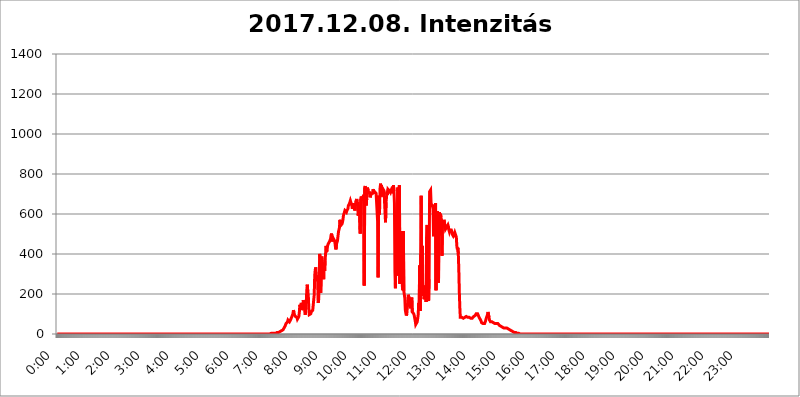
| Category | 2017.12.08. Intenzitás [W/m^2] |
|---|---|
| 0.0 | 0 |
| 0.0006944444444444445 | 0 |
| 0.001388888888888889 | 0 |
| 0.0020833333333333333 | 0 |
| 0.002777777777777778 | 0 |
| 0.003472222222222222 | 0 |
| 0.004166666666666667 | 0 |
| 0.004861111111111111 | 0 |
| 0.005555555555555556 | 0 |
| 0.0062499999999999995 | 0 |
| 0.006944444444444444 | 0 |
| 0.007638888888888889 | 0 |
| 0.008333333333333333 | 0 |
| 0.009027777777777779 | 0 |
| 0.009722222222222222 | 0 |
| 0.010416666666666666 | 0 |
| 0.011111111111111112 | 0 |
| 0.011805555555555555 | 0 |
| 0.012499999999999999 | 0 |
| 0.013194444444444444 | 0 |
| 0.013888888888888888 | 0 |
| 0.014583333333333332 | 0 |
| 0.015277777777777777 | 0 |
| 0.015972222222222224 | 0 |
| 0.016666666666666666 | 0 |
| 0.017361111111111112 | 0 |
| 0.018055555555555557 | 0 |
| 0.01875 | 0 |
| 0.019444444444444445 | 0 |
| 0.02013888888888889 | 0 |
| 0.020833333333333332 | 0 |
| 0.02152777777777778 | 0 |
| 0.022222222222222223 | 0 |
| 0.02291666666666667 | 0 |
| 0.02361111111111111 | 0 |
| 0.024305555555555556 | 0 |
| 0.024999999999999998 | 0 |
| 0.025694444444444447 | 0 |
| 0.02638888888888889 | 0 |
| 0.027083333333333334 | 0 |
| 0.027777777777777776 | 0 |
| 0.02847222222222222 | 0 |
| 0.029166666666666664 | 0 |
| 0.029861111111111113 | 0 |
| 0.030555555555555555 | 0 |
| 0.03125 | 0 |
| 0.03194444444444445 | 0 |
| 0.03263888888888889 | 0 |
| 0.03333333333333333 | 0 |
| 0.034027777777777775 | 0 |
| 0.034722222222222224 | 0 |
| 0.035416666666666666 | 0 |
| 0.036111111111111115 | 0 |
| 0.03680555555555556 | 0 |
| 0.0375 | 0 |
| 0.03819444444444444 | 0 |
| 0.03888888888888889 | 0 |
| 0.03958333333333333 | 0 |
| 0.04027777777777778 | 0 |
| 0.04097222222222222 | 0 |
| 0.041666666666666664 | 0 |
| 0.042361111111111106 | 0 |
| 0.04305555555555556 | 0 |
| 0.043750000000000004 | 0 |
| 0.044444444444444446 | 0 |
| 0.04513888888888889 | 0 |
| 0.04583333333333334 | 0 |
| 0.04652777777777778 | 0 |
| 0.04722222222222222 | 0 |
| 0.04791666666666666 | 0 |
| 0.04861111111111111 | 0 |
| 0.049305555555555554 | 0 |
| 0.049999999999999996 | 0 |
| 0.05069444444444445 | 0 |
| 0.051388888888888894 | 0 |
| 0.052083333333333336 | 0 |
| 0.05277777777777778 | 0 |
| 0.05347222222222222 | 0 |
| 0.05416666666666667 | 0 |
| 0.05486111111111111 | 0 |
| 0.05555555555555555 | 0 |
| 0.05625 | 0 |
| 0.05694444444444444 | 0 |
| 0.057638888888888885 | 0 |
| 0.05833333333333333 | 0 |
| 0.05902777777777778 | 0 |
| 0.059722222222222225 | 0 |
| 0.06041666666666667 | 0 |
| 0.061111111111111116 | 0 |
| 0.06180555555555556 | 0 |
| 0.0625 | 0 |
| 0.06319444444444444 | 0 |
| 0.06388888888888888 | 0 |
| 0.06458333333333334 | 0 |
| 0.06527777777777778 | 0 |
| 0.06597222222222222 | 0 |
| 0.06666666666666667 | 0 |
| 0.06736111111111111 | 0 |
| 0.06805555555555555 | 0 |
| 0.06874999999999999 | 0 |
| 0.06944444444444443 | 0 |
| 0.07013888888888889 | 0 |
| 0.07083333333333333 | 0 |
| 0.07152777777777779 | 0 |
| 0.07222222222222223 | 0 |
| 0.07291666666666667 | 0 |
| 0.07361111111111111 | 0 |
| 0.07430555555555556 | 0 |
| 0.075 | 0 |
| 0.07569444444444444 | 0 |
| 0.0763888888888889 | 0 |
| 0.07708333333333334 | 0 |
| 0.07777777777777778 | 0 |
| 0.07847222222222222 | 0 |
| 0.07916666666666666 | 0 |
| 0.0798611111111111 | 0 |
| 0.08055555555555556 | 0 |
| 0.08125 | 0 |
| 0.08194444444444444 | 0 |
| 0.08263888888888889 | 0 |
| 0.08333333333333333 | 0 |
| 0.08402777777777777 | 0 |
| 0.08472222222222221 | 0 |
| 0.08541666666666665 | 0 |
| 0.08611111111111112 | 0 |
| 0.08680555555555557 | 0 |
| 0.08750000000000001 | 0 |
| 0.08819444444444445 | 0 |
| 0.08888888888888889 | 0 |
| 0.08958333333333333 | 0 |
| 0.09027777777777778 | 0 |
| 0.09097222222222222 | 0 |
| 0.09166666666666667 | 0 |
| 0.09236111111111112 | 0 |
| 0.09305555555555556 | 0 |
| 0.09375 | 0 |
| 0.09444444444444444 | 0 |
| 0.09513888888888888 | 0 |
| 0.09583333333333333 | 0 |
| 0.09652777777777777 | 0 |
| 0.09722222222222222 | 0 |
| 0.09791666666666667 | 0 |
| 0.09861111111111111 | 0 |
| 0.09930555555555555 | 0 |
| 0.09999999999999999 | 0 |
| 0.10069444444444443 | 0 |
| 0.1013888888888889 | 0 |
| 0.10208333333333335 | 0 |
| 0.10277777777777779 | 0 |
| 0.10347222222222223 | 0 |
| 0.10416666666666667 | 0 |
| 0.10486111111111111 | 0 |
| 0.10555555555555556 | 0 |
| 0.10625 | 0 |
| 0.10694444444444444 | 0 |
| 0.1076388888888889 | 0 |
| 0.10833333333333334 | 0 |
| 0.10902777777777778 | 0 |
| 0.10972222222222222 | 0 |
| 0.1111111111111111 | 0 |
| 0.11180555555555556 | 0 |
| 0.11180555555555556 | 0 |
| 0.1125 | 0 |
| 0.11319444444444444 | 0 |
| 0.11388888888888889 | 0 |
| 0.11458333333333333 | 0 |
| 0.11527777777777777 | 0 |
| 0.11597222222222221 | 0 |
| 0.11666666666666665 | 0 |
| 0.1173611111111111 | 0 |
| 0.11805555555555557 | 0 |
| 0.11944444444444445 | 0 |
| 0.12013888888888889 | 0 |
| 0.12083333333333333 | 0 |
| 0.12152777777777778 | 0 |
| 0.12222222222222223 | 0 |
| 0.12291666666666667 | 0 |
| 0.12291666666666667 | 0 |
| 0.12361111111111112 | 0 |
| 0.12430555555555556 | 0 |
| 0.125 | 0 |
| 0.12569444444444444 | 0 |
| 0.12638888888888888 | 0 |
| 0.12708333333333333 | 0 |
| 0.16875 | 0 |
| 0.12847222222222224 | 0 |
| 0.12916666666666668 | 0 |
| 0.12986111111111112 | 0 |
| 0.13055555555555556 | 0 |
| 0.13125 | 0 |
| 0.13194444444444445 | 0 |
| 0.1326388888888889 | 0 |
| 0.13333333333333333 | 0 |
| 0.13402777777777777 | 0 |
| 0.13402777777777777 | 0 |
| 0.13472222222222222 | 0 |
| 0.13541666666666666 | 0 |
| 0.1361111111111111 | 0 |
| 0.13749999999999998 | 0 |
| 0.13819444444444443 | 0 |
| 0.1388888888888889 | 0 |
| 0.13958333333333334 | 0 |
| 0.14027777777777778 | 0 |
| 0.14097222222222222 | 0 |
| 0.14166666666666666 | 0 |
| 0.1423611111111111 | 0 |
| 0.14305555555555557 | 0 |
| 0.14375000000000002 | 0 |
| 0.14444444444444446 | 0 |
| 0.1451388888888889 | 0 |
| 0.1451388888888889 | 0 |
| 0.14652777777777778 | 0 |
| 0.14722222222222223 | 0 |
| 0.14791666666666667 | 0 |
| 0.1486111111111111 | 0 |
| 0.14930555555555555 | 0 |
| 0.15 | 0 |
| 0.15069444444444444 | 0 |
| 0.15138888888888888 | 0 |
| 0.15208333333333332 | 0 |
| 0.15277777777777776 | 0 |
| 0.15347222222222223 | 0 |
| 0.15416666666666667 | 0 |
| 0.15486111111111112 | 0 |
| 0.15555555555555556 | 0 |
| 0.15625 | 0 |
| 0.15694444444444444 | 0 |
| 0.15763888888888888 | 0 |
| 0.15833333333333333 | 0 |
| 0.15902777777777777 | 0 |
| 0.15972222222222224 | 0 |
| 0.16041666666666668 | 0 |
| 0.16111111111111112 | 0 |
| 0.16180555555555556 | 0 |
| 0.1625 | 0 |
| 0.16319444444444445 | 0 |
| 0.1638888888888889 | 0 |
| 0.16458333333333333 | 0 |
| 0.16527777777777777 | 0 |
| 0.16597222222222222 | 0 |
| 0.16666666666666666 | 0 |
| 0.1673611111111111 | 0 |
| 0.16805555555555554 | 0 |
| 0.16874999999999998 | 0 |
| 0.16944444444444443 | 0 |
| 0.17013888888888887 | 0 |
| 0.1708333333333333 | 0 |
| 0.17152777777777775 | 0 |
| 0.17222222222222225 | 0 |
| 0.1729166666666667 | 0 |
| 0.17361111111111113 | 0 |
| 0.17430555555555557 | 0 |
| 0.17500000000000002 | 0 |
| 0.17569444444444446 | 0 |
| 0.1763888888888889 | 0 |
| 0.17708333333333334 | 0 |
| 0.17777777777777778 | 0 |
| 0.17847222222222223 | 0 |
| 0.17916666666666667 | 0 |
| 0.1798611111111111 | 0 |
| 0.18055555555555555 | 0 |
| 0.18125 | 0 |
| 0.18194444444444444 | 0 |
| 0.1826388888888889 | 0 |
| 0.18333333333333335 | 0 |
| 0.1840277777777778 | 0 |
| 0.18472222222222223 | 0 |
| 0.18541666666666667 | 0 |
| 0.18611111111111112 | 0 |
| 0.18680555555555556 | 0 |
| 0.1875 | 0 |
| 0.18819444444444444 | 0 |
| 0.18888888888888888 | 0 |
| 0.18958333333333333 | 0 |
| 0.19027777777777777 | 0 |
| 0.1909722222222222 | 0 |
| 0.19166666666666665 | 0 |
| 0.19236111111111112 | 0 |
| 0.19305555555555554 | 0 |
| 0.19375 | 0 |
| 0.19444444444444445 | 0 |
| 0.1951388888888889 | 0 |
| 0.19583333333333333 | 0 |
| 0.19652777777777777 | 0 |
| 0.19722222222222222 | 0 |
| 0.19791666666666666 | 0 |
| 0.1986111111111111 | 0 |
| 0.19930555555555554 | 0 |
| 0.19999999999999998 | 0 |
| 0.20069444444444443 | 0 |
| 0.20138888888888887 | 0 |
| 0.2020833333333333 | 0 |
| 0.2027777777777778 | 0 |
| 0.2034722222222222 | 0 |
| 0.2041666666666667 | 0 |
| 0.20486111111111113 | 0 |
| 0.20555555555555557 | 0 |
| 0.20625000000000002 | 0 |
| 0.20694444444444446 | 0 |
| 0.2076388888888889 | 0 |
| 0.20833333333333334 | 0 |
| 0.20902777777777778 | 0 |
| 0.20972222222222223 | 0 |
| 0.21041666666666667 | 0 |
| 0.2111111111111111 | 0 |
| 0.21180555555555555 | 0 |
| 0.2125 | 0 |
| 0.21319444444444444 | 0 |
| 0.2138888888888889 | 0 |
| 0.21458333333333335 | 0 |
| 0.2152777777777778 | 0 |
| 0.21597222222222223 | 0 |
| 0.21666666666666667 | 0 |
| 0.21736111111111112 | 0 |
| 0.21805555555555556 | 0 |
| 0.21875 | 0 |
| 0.21944444444444444 | 0 |
| 0.22013888888888888 | 0 |
| 0.22083333333333333 | 0 |
| 0.22152777777777777 | 0 |
| 0.2222222222222222 | 0 |
| 0.22291666666666665 | 0 |
| 0.2236111111111111 | 0 |
| 0.22430555555555556 | 0 |
| 0.225 | 0 |
| 0.22569444444444445 | 0 |
| 0.2263888888888889 | 0 |
| 0.22708333333333333 | 0 |
| 0.22777777777777777 | 0 |
| 0.22847222222222222 | 0 |
| 0.22916666666666666 | 0 |
| 0.2298611111111111 | 0 |
| 0.23055555555555554 | 0 |
| 0.23124999999999998 | 0 |
| 0.23194444444444443 | 0 |
| 0.23263888888888887 | 0 |
| 0.2333333333333333 | 0 |
| 0.2340277777777778 | 0 |
| 0.2347222222222222 | 0 |
| 0.2354166666666667 | 0 |
| 0.23611111111111113 | 0 |
| 0.23680555555555557 | 0 |
| 0.23750000000000002 | 0 |
| 0.23819444444444446 | 0 |
| 0.2388888888888889 | 0 |
| 0.23958333333333334 | 0 |
| 0.24027777777777778 | 0 |
| 0.24097222222222223 | 0 |
| 0.24166666666666667 | 0 |
| 0.2423611111111111 | 0 |
| 0.24305555555555555 | 0 |
| 0.24375 | 0 |
| 0.24444444444444446 | 0 |
| 0.24513888888888888 | 0 |
| 0.24583333333333335 | 0 |
| 0.2465277777777778 | 0 |
| 0.24722222222222223 | 0 |
| 0.24791666666666667 | 0 |
| 0.24861111111111112 | 0 |
| 0.24930555555555556 | 0 |
| 0.25 | 0 |
| 0.25069444444444444 | 0 |
| 0.2513888888888889 | 0 |
| 0.2520833333333333 | 0 |
| 0.25277777777777777 | 0 |
| 0.2534722222222222 | 0 |
| 0.25416666666666665 | 0 |
| 0.2548611111111111 | 0 |
| 0.2555555555555556 | 0 |
| 0.25625000000000003 | 0 |
| 0.2569444444444445 | 0 |
| 0.2576388888888889 | 0 |
| 0.25833333333333336 | 0 |
| 0.2590277777777778 | 0 |
| 0.25972222222222224 | 0 |
| 0.2604166666666667 | 0 |
| 0.2611111111111111 | 0 |
| 0.26180555555555557 | 0 |
| 0.2625 | 0 |
| 0.26319444444444445 | 0 |
| 0.2638888888888889 | 0 |
| 0.26458333333333334 | 0 |
| 0.2652777777777778 | 0 |
| 0.2659722222222222 | 0 |
| 0.26666666666666666 | 0 |
| 0.2673611111111111 | 0 |
| 0.26805555555555555 | 0 |
| 0.26875 | 0 |
| 0.26944444444444443 | 0 |
| 0.2701388888888889 | 0 |
| 0.2708333333333333 | 0 |
| 0.27152777777777776 | 0 |
| 0.2722222222222222 | 0 |
| 0.27291666666666664 | 0 |
| 0.2736111111111111 | 0 |
| 0.2743055555555555 | 0 |
| 0.27499999999999997 | 0 |
| 0.27569444444444446 | 0 |
| 0.27638888888888885 | 0 |
| 0.27708333333333335 | 0 |
| 0.2777777777777778 | 0 |
| 0.27847222222222223 | 0 |
| 0.2791666666666667 | 0 |
| 0.2798611111111111 | 0 |
| 0.28055555555555556 | 0 |
| 0.28125 | 0 |
| 0.28194444444444444 | 0 |
| 0.2826388888888889 | 0 |
| 0.2833333333333333 | 0 |
| 0.28402777777777777 | 0 |
| 0.2847222222222222 | 0 |
| 0.28541666666666665 | 0 |
| 0.28611111111111115 | 0 |
| 0.28680555555555554 | 0 |
| 0.28750000000000003 | 0 |
| 0.2881944444444445 | 0 |
| 0.2888888888888889 | 0 |
| 0.28958333333333336 | 0 |
| 0.2902777777777778 | 0 |
| 0.29097222222222224 | 0 |
| 0.2916666666666667 | 0 |
| 0.2923611111111111 | 0 |
| 0.29305555555555557 | 0 |
| 0.29375 | 0 |
| 0.29444444444444445 | 0 |
| 0.2951388888888889 | 0 |
| 0.29583333333333334 | 0 |
| 0.2965277777777778 | 0 |
| 0.2972222222222222 | 0 |
| 0.29791666666666666 | 0 |
| 0.2986111111111111 | 0 |
| 0.29930555555555555 | 3.525 |
| 0.3 | 3.525 |
| 0.30069444444444443 | 3.525 |
| 0.3013888888888889 | 3.525 |
| 0.3020833333333333 | 3.525 |
| 0.30277777777777776 | 3.525 |
| 0.3034722222222222 | 3.525 |
| 0.30416666666666664 | 3.525 |
| 0.3048611111111111 | 3.525 |
| 0.3055555555555555 | 3.525 |
| 0.30624999999999997 | 3.525 |
| 0.3069444444444444 | 7.887 |
| 0.3076388888888889 | 7.887 |
| 0.30833333333333335 | 7.887 |
| 0.3090277777777778 | 7.887 |
| 0.30972222222222223 | 7.887 |
| 0.3104166666666667 | 7.887 |
| 0.3111111111111111 | 7.887 |
| 0.31180555555555556 | 12.257 |
| 0.3125 | 12.257 |
| 0.31319444444444444 | 16.636 |
| 0.3138888888888889 | 16.636 |
| 0.3145833333333333 | 16.636 |
| 0.31527777777777777 | 21.024 |
| 0.3159722222222222 | 21.024 |
| 0.31666666666666665 | 21.024 |
| 0.31736111111111115 | 25.419 |
| 0.31805555555555554 | 29.823 |
| 0.31875000000000003 | 34.234 |
| 0.3194444444444445 | 38.653 |
| 0.3201388888888889 | 43.079 |
| 0.32083333333333336 | 51.951 |
| 0.3215277777777778 | 56.398 |
| 0.32222222222222224 | 56.398 |
| 0.3229166666666667 | 60.85 |
| 0.3236111111111111 | 69.775 |
| 0.32430555555555557 | 69.775 |
| 0.325 | 65.31 |
| 0.32569444444444445 | 60.85 |
| 0.3263888888888889 | 60.85 |
| 0.32708333333333334 | 69.775 |
| 0.3277777777777778 | 69.775 |
| 0.3284722222222222 | 74.246 |
| 0.32916666666666666 | 87.692 |
| 0.3298611111111111 | 83.205 |
| 0.33055555555555555 | 101.184 |
| 0.33125 | 119.235 |
| 0.33194444444444443 | 110.201 |
| 0.3326388888888889 | 96.682 |
| 0.3333333333333333 | 92.184 |
| 0.3340277777777778 | 87.692 |
| 0.3347222222222222 | 87.692 |
| 0.3354166666666667 | 83.205 |
| 0.3361111111111111 | 83.205 |
| 0.3368055555555556 | 74.246 |
| 0.33749999999999997 | 74.246 |
| 0.33819444444444446 | 74.246 |
| 0.33888888888888885 | 87.692 |
| 0.33958333333333335 | 110.201 |
| 0.34027777777777773 | 146.423 |
| 0.34097222222222223 | 137.347 |
| 0.3416666666666666 | 137.347 |
| 0.3423611111111111 | 155.509 |
| 0.3430555555555555 | 137.347 |
| 0.34375 | 119.235 |
| 0.3444444444444445 | 146.423 |
| 0.3451388888888889 | 169.156 |
| 0.3458333333333334 | 137.347 |
| 0.34652777777777777 | 155.509 |
| 0.34722222222222227 | 150.964 |
| 0.34791666666666665 | 96.682 |
| 0.34861111111111115 | 132.814 |
| 0.34930555555555554 | 164.605 |
| 0.35000000000000003 | 219.309 |
| 0.3506944444444444 | 246.689 |
| 0.3513888888888889 | 210.182 |
| 0.3520833333333333 | 196.497 |
| 0.3527777777777778 | 132.814 |
| 0.3534722222222222 | 96.682 |
| 0.3541666666666667 | 92.184 |
| 0.3548611111111111 | 92.184 |
| 0.35555555555555557 | 101.184 |
| 0.35625 | 110.201 |
| 0.35694444444444445 | 110.201 |
| 0.3576388888888889 | 110.201 |
| 0.35833333333333334 | 119.235 |
| 0.3590277777777778 | 123.758 |
| 0.3597222222222222 | 123.758 |
| 0.36041666666666666 | 196.497 |
| 0.3611111111111111 | 292.259 |
| 0.36180555555555555 | 319.517 |
| 0.3625 | 333.113 |
| 0.36319444444444443 | 269.49 |
| 0.3638888888888889 | 292.259 |
| 0.3645833333333333 | 283.156 |
| 0.3652777777777778 | 260.373 |
| 0.3659722222222222 | 155.509 |
| 0.3666666666666667 | 173.709 |
| 0.3673611111111111 | 255.813 |
| 0.3680555555555556 | 400.638 |
| 0.36874999999999997 | 378.224 |
| 0.36944444444444446 | 205.62 |
| 0.37013888888888885 | 278.603 |
| 0.37083333333333335 | 387.202 |
| 0.37152777777777773 | 373.729 |
| 0.37222222222222223 | 373.729 |
| 0.3729166666666666 | 369.23 |
| 0.3736111111111111 | 274.047 |
| 0.3743055555555555 | 355.712 |
| 0.375 | 314.98 |
| 0.3756944444444445 | 369.23 |
| 0.3763888888888889 | 405.108 |
| 0.3770833333333334 | 440.702 |
| 0.37777777777777777 | 409.574 |
| 0.37847222222222227 | 422.943 |
| 0.37916666666666665 | 440.702 |
| 0.37986111111111115 | 449.551 |
| 0.38055555555555554 | 445.129 |
| 0.38125000000000003 | 453.968 |
| 0.3819444444444444 | 462.786 |
| 0.3826388888888889 | 458.38 |
| 0.3833333333333333 | 475.972 |
| 0.3840277777777778 | 493.475 |
| 0.3847222222222222 | 502.192 |
| 0.3854166666666667 | 497.836 |
| 0.3861111111111111 | 462.786 |
| 0.38680555555555557 | 480.356 |
| 0.3875 | 480.356 |
| 0.38819444444444445 | 480.356 |
| 0.3888888888888889 | 467.187 |
| 0.38958333333333334 | 453.968 |
| 0.3902777777777778 | 431.833 |
| 0.3909722222222222 | 422.943 |
| 0.39166666666666666 | 449.551 |
| 0.3923611111111111 | 458.38 |
| 0.39305555555555555 | 467.187 |
| 0.39375 | 489.108 |
| 0.39444444444444443 | 510.885 |
| 0.3951388888888889 | 506.542 |
| 0.3958333333333333 | 532.513 |
| 0.3965277777777778 | 571.049 |
| 0.3972222222222222 | 541.121 |
| 0.3979166666666667 | 541.121 |
| 0.3986111111111111 | 536.82 |
| 0.3993055555555556 | 549.704 |
| 0.39999999999999997 | 558.261 |
| 0.40069444444444446 | 571.049 |
| 0.40138888888888885 | 592.233 |
| 0.40208333333333335 | 596.45 |
| 0.40277777777777773 | 609.062 |
| 0.40347222222222223 | 617.436 |
| 0.4041666666666666 | 617.436 |
| 0.4048611111111111 | 613.252 |
| 0.4055555555555555 | 609.062 |
| 0.40625 | 617.436 |
| 0.4069444444444445 | 621.613 |
| 0.4076388888888889 | 625.784 |
| 0.4083333333333334 | 642.4 |
| 0.40902777777777777 | 646.537 |
| 0.40972222222222227 | 650.667 |
| 0.41041666666666665 | 654.791 |
| 0.41111111111111115 | 667.123 |
| 0.41180555555555554 | 671.22 |
| 0.41250000000000003 | 667.123 |
| 0.4131944444444444 | 642.4 |
| 0.4138888888888889 | 625.784 |
| 0.4145833333333333 | 634.105 |
| 0.4152777777777778 | 654.791 |
| 0.4159722222222222 | 634.105 |
| 0.4166666666666667 | 638.256 |
| 0.4173611111111111 | 617.436 |
| 0.41805555555555557 | 634.105 |
| 0.41875 | 663.019 |
| 0.41944444444444445 | 663.019 |
| 0.4201388888888889 | 675.311 |
| 0.42083333333333334 | 642.4 |
| 0.4215277777777778 | 658.909 |
| 0.4222222222222222 | 592.233 |
| 0.42291666666666666 | 634.105 |
| 0.4236111111111111 | 642.4 |
| 0.42430555555555555 | 638.256 |
| 0.425 | 502.192 |
| 0.42569444444444443 | 675.311 |
| 0.4263888888888889 | 687.544 |
| 0.4270833333333333 | 683.473 |
| 0.4277777777777778 | 667.123 |
| 0.4284722222222222 | 683.473 |
| 0.4291666666666667 | 683.473 |
| 0.4298611111111111 | 695.666 |
| 0.4305555555555556 | 242.127 |
| 0.43124999999999997 | 731.896 |
| 0.43194444444444446 | 739.877 |
| 0.43263888888888885 | 719.877 |
| 0.43333333333333335 | 642.4 |
| 0.43402777777777773 | 675.311 |
| 0.43472222222222223 | 731.896 |
| 0.4354166666666666 | 735.89 |
| 0.4361111111111111 | 719.877 |
| 0.4368055555555555 | 699.717 |
| 0.4375 | 703.762 |
| 0.4381944444444445 | 711.832 |
| 0.4388888888888889 | 683.473 |
| 0.4395833333333334 | 691.608 |
| 0.44027777777777777 | 699.717 |
| 0.44097222222222227 | 699.717 |
| 0.44166666666666665 | 695.666 |
| 0.44236111111111115 | 703.762 |
| 0.44305555555555554 | 723.889 |
| 0.44375000000000003 | 707.8 |
| 0.4444444444444444 | 699.717 |
| 0.4451388888888889 | 711.832 |
| 0.4458333333333333 | 711.832 |
| 0.4465277777777778 | 707.8 |
| 0.4472222222222222 | 703.762 |
| 0.4479166666666667 | 703.762 |
| 0.4486111111111111 | 703.762 |
| 0.44930555555555557 | 562.53 |
| 0.45 | 283.156 |
| 0.45069444444444445 | 691.608 |
| 0.4513888888888889 | 596.45 |
| 0.45208333333333334 | 613.252 |
| 0.4527777777777778 | 727.896 |
| 0.4534722222222222 | 751.803 |
| 0.45416666666666666 | 711.832 |
| 0.4548611111111111 | 743.859 |
| 0.45555555555555555 | 687.544 |
| 0.45625 | 727.896 |
| 0.45694444444444443 | 723.889 |
| 0.4576388888888889 | 723.889 |
| 0.4583333333333333 | 715.858 |
| 0.4590277777777778 | 711.832 |
| 0.4597222222222222 | 719.877 |
| 0.4604166666666667 | 558.261 |
| 0.4611111111111111 | 658.909 |
| 0.4618055555555556 | 683.473 |
| 0.46249999999999997 | 711.832 |
| 0.46319444444444446 | 695.666 |
| 0.46388888888888885 | 723.889 |
| 0.46458333333333335 | 727.896 |
| 0.46527777777777773 | 727.896 |
| 0.46597222222222223 | 715.858 |
| 0.4666666666666666 | 711.832 |
| 0.4673611111111111 | 707.8 |
| 0.4680555555555555 | 715.858 |
| 0.46875 | 719.877 |
| 0.4694444444444445 | 715.858 |
| 0.4701388888888889 | 735.89 |
| 0.4708333333333334 | 703.762 |
| 0.47152777777777777 | 743.859 |
| 0.47222222222222227 | 715.858 |
| 0.47291666666666665 | 654.791 |
| 0.47361111111111115 | 310.44 |
| 0.47430555555555554 | 228.436 |
| 0.47500000000000003 | 549.704 |
| 0.4756944444444444 | 342.162 |
| 0.4763888888888889 | 609.062 |
| 0.4770833333333333 | 502.192 |
| 0.4777777777777778 | 731.896 |
| 0.4784722222222222 | 292.259 |
| 0.4791666666666667 | 646.537 |
| 0.4798611111111111 | 743.859 |
| 0.48055555555555557 | 251.251 |
| 0.48125 | 255.813 |
| 0.48194444444444445 | 255.813 |
| 0.4826388888888889 | 515.223 |
| 0.48333333333333334 | 467.187 |
| 0.4840277777777778 | 237.564 |
| 0.4847222222222222 | 219.309 |
| 0.48541666666666666 | 515.223 |
| 0.4861111111111111 | 214.746 |
| 0.48680555555555555 | 214.746 |
| 0.4875 | 178.264 |
| 0.48819444444444443 | 119.235 |
| 0.4888888888888889 | 105.69 |
| 0.4895833333333333 | 92.184 |
| 0.4902777777777778 | 101.184 |
| 0.4909722222222222 | 132.814 |
| 0.4916666666666667 | 164.605 |
| 0.4923611111111111 | 196.497 |
| 0.4930555555555556 | 196.497 |
| 0.49374999999999997 | 173.709 |
| 0.49444444444444446 | 146.423 |
| 0.49513888888888885 | 128.284 |
| 0.49583333333333335 | 132.814 |
| 0.49652777777777773 | 150.964 |
| 0.49722222222222223 | 182.82 |
| 0.4979166666666666 | 110.201 |
| 0.4986111111111111 | 110.201 |
| 0.4993055555555555 | 114.716 |
| 0.5 | 101.184 |
| 0.5006944444444444 | 92.184 |
| 0.5013888888888889 | 78.722 |
| 0.5020833333333333 | 65.31 |
| 0.5027777777777778 | 47.511 |
| 0.5034722222222222 | 43.079 |
| 0.5041666666666667 | 47.511 |
| 0.5048611111111111 | 60.85 |
| 0.5055555555555555 | 78.722 |
| 0.50625 | 96.682 |
| 0.5069444444444444 | 155.509 |
| 0.5076388888888889 | 128.284 |
| 0.5083333333333333 | 342.162 |
| 0.5090277777777777 | 114.716 |
| 0.5097222222222222 | 400.638 |
| 0.5104166666666666 | 691.608 |
| 0.5111111111111112 | 228.436 |
| 0.5118055555555555 | 440.702 |
| 0.5125000000000001 | 191.937 |
| 0.5131944444444444 | 210.182 |
| 0.513888888888889 | 201.058 |
| 0.5145833333333333 | 173.709 |
| 0.5152777777777778 | 196.497 |
| 0.5159722222222222 | 242.127 |
| 0.5166666666666667 | 182.82 |
| 0.517361111111111 | 160.056 |
| 0.5180555555555556 | 484.735 |
| 0.5187499999999999 | 545.416 |
| 0.5194444444444445 | 233 |
| 0.5201388888888888 | 223.873 |
| 0.5208333333333334 | 164.605 |
| 0.5215277777777778 | 274.047 |
| 0.5222222222222223 | 711.832 |
| 0.5229166666666667 | 715.858 |
| 0.5236111111111111 | 719.877 |
| 0.5243055555555556 | 654.791 |
| 0.525 | 646.537 |
| 0.5256944444444445 | 642.4 |
| 0.5263888888888889 | 638.256 |
| 0.5270833333333333 | 625.784 |
| 0.5277777777777778 | 489.108 |
| 0.5284722222222222 | 613.252 |
| 0.5291666666666667 | 646.537 |
| 0.5298611111111111 | 541.121 |
| 0.5305555555555556 | 654.791 |
| 0.53125 | 219.309 |
| 0.5319444444444444 | 613.252 |
| 0.5326388888888889 | 600.661 |
| 0.5333333333333333 | 613.252 |
| 0.5340277777777778 | 528.2 |
| 0.5347222222222222 | 255.813 |
| 0.5354166666666667 | 579.542 |
| 0.5361111111111111 | 609.062 |
| 0.5368055555555555 | 592.233 |
| 0.5375 | 600.661 |
| 0.5381944444444444 | 583.779 |
| 0.5388888888888889 | 536.82 |
| 0.5395833333333333 | 391.685 |
| 0.5402777777777777 | 562.53 |
| 0.5409722222222222 | 558.261 |
| 0.5416666666666666 | 553.986 |
| 0.5423611111111112 | 571.049 |
| 0.5430555555555555 | 571.049 |
| 0.5437500000000001 | 541.121 |
| 0.5444444444444444 | 523.88 |
| 0.545138888888889 | 519.555 |
| 0.5458333333333333 | 528.2 |
| 0.5465277777777778 | 536.82 |
| 0.5472222222222222 | 541.121 |
| 0.5479166666666667 | 545.416 |
| 0.548611111111111 | 536.82 |
| 0.5493055555555556 | 519.555 |
| 0.5499999999999999 | 510.885 |
| 0.5506944444444445 | 519.555 |
| 0.5513888888888888 | 519.555 |
| 0.5520833333333334 | 519.555 |
| 0.5527777777777778 | 519.555 |
| 0.5534722222222223 | 510.885 |
| 0.5541666666666667 | 497.836 |
| 0.5548611111111111 | 493.475 |
| 0.5555555555555556 | 489.108 |
| 0.55625 | 489.108 |
| 0.5569444444444445 | 497.836 |
| 0.5576388888888889 | 506.542 |
| 0.5583333333333333 | 506.542 |
| 0.5590277777777778 | 506.542 |
| 0.5597222222222222 | 484.735 |
| 0.5604166666666667 | 440.702 |
| 0.5611111111111111 | 422.943 |
| 0.5618055555555556 | 431.833 |
| 0.5625 | 400.638 |
| 0.5631944444444444 | 324.052 |
| 0.5638888888888889 | 214.746 |
| 0.5645833333333333 | 137.347 |
| 0.5652777777777778 | 83.205 |
| 0.5659722222222222 | 78.722 |
| 0.5666666666666667 | 83.205 |
| 0.5673611111111111 | 83.205 |
| 0.5680555555555555 | 83.205 |
| 0.56875 | 78.722 |
| 0.5694444444444444 | 78.722 |
| 0.5701388888888889 | 83.205 |
| 0.5708333333333333 | 83.205 |
| 0.5715277777777777 | 83.205 |
| 0.5722222222222222 | 87.692 |
| 0.5729166666666666 | 83.205 |
| 0.5736111111111112 | 87.692 |
| 0.5743055555555555 | 83.205 |
| 0.5750000000000001 | 83.205 |
| 0.5756944444444444 | 83.205 |
| 0.576388888888889 | 83.205 |
| 0.5770833333333333 | 83.205 |
| 0.5777777777777778 | 83.205 |
| 0.5784722222222222 | 78.722 |
| 0.5791666666666667 | 78.722 |
| 0.579861111111111 | 78.722 |
| 0.5805555555555556 | 78.722 |
| 0.5812499999999999 | 78.722 |
| 0.5819444444444445 | 78.722 |
| 0.5826388888888888 | 83.205 |
| 0.5833333333333334 | 83.205 |
| 0.5840277777777778 | 87.692 |
| 0.5847222222222223 | 92.184 |
| 0.5854166666666667 | 92.184 |
| 0.5861111111111111 | 92.184 |
| 0.5868055555555556 | 96.682 |
| 0.5875 | 101.184 |
| 0.5881944444444445 | 101.184 |
| 0.5888888888888889 | 101.184 |
| 0.5895833333333333 | 101.184 |
| 0.5902777777777778 | 101.184 |
| 0.5909722222222222 | 96.682 |
| 0.5916666666666667 | 83.205 |
| 0.5923611111111111 | 78.722 |
| 0.5930555555555556 | 74.246 |
| 0.59375 | 69.775 |
| 0.5944444444444444 | 65.31 |
| 0.5951388888888889 | 56.398 |
| 0.5958333333333333 | 56.398 |
| 0.5965277777777778 | 56.398 |
| 0.5972222222222222 | 51.951 |
| 0.5979166666666667 | 51.951 |
| 0.5986111111111111 | 51.951 |
| 0.5993055555555555 | 51.951 |
| 0.6 | 56.398 |
| 0.6006944444444444 | 65.31 |
| 0.6013888888888889 | 69.775 |
| 0.6020833333333333 | 83.205 |
| 0.6027777777777777 | 83.205 |
| 0.6034722222222222 | 96.682 |
| 0.6041666666666666 | 110.201 |
| 0.6048611111111112 | 110.201 |
| 0.6055555555555555 | 83.205 |
| 0.6062500000000001 | 69.775 |
| 0.6069444444444444 | 65.31 |
| 0.607638888888889 | 60.85 |
| 0.6083333333333333 | 60.85 |
| 0.6090277777777778 | 60.85 |
| 0.6097222222222222 | 60.85 |
| 0.6104166666666667 | 60.85 |
| 0.611111111111111 | 56.398 |
| 0.6118055555555556 | 56.398 |
| 0.6124999999999999 | 56.398 |
| 0.6131944444444445 | 51.951 |
| 0.6138888888888888 | 51.951 |
| 0.6145833333333334 | 51.951 |
| 0.6152777777777778 | 51.951 |
| 0.6159722222222223 | 51.951 |
| 0.6166666666666667 | 51.951 |
| 0.6173611111111111 | 51.951 |
| 0.6180555555555556 | 51.951 |
| 0.61875 | 47.511 |
| 0.6194444444444445 | 47.511 |
| 0.6201388888888889 | 43.079 |
| 0.6208333333333333 | 43.079 |
| 0.6215277777777778 | 38.653 |
| 0.6222222222222222 | 38.653 |
| 0.6229166666666667 | 34.234 |
| 0.6236111111111111 | 34.234 |
| 0.6243055555555556 | 34.234 |
| 0.625 | 29.823 |
| 0.6256944444444444 | 29.823 |
| 0.6263888888888889 | 29.823 |
| 0.6270833333333333 | 29.823 |
| 0.6277777777777778 | 29.823 |
| 0.6284722222222222 | 29.823 |
| 0.6291666666666667 | 29.823 |
| 0.6298611111111111 | 29.823 |
| 0.6305555555555555 | 29.823 |
| 0.63125 | 29.823 |
| 0.6319444444444444 | 25.419 |
| 0.6326388888888889 | 25.419 |
| 0.6333333333333333 | 25.419 |
| 0.6340277777777777 | 21.024 |
| 0.6347222222222222 | 21.024 |
| 0.6354166666666666 | 21.024 |
| 0.6361111111111112 | 21.024 |
| 0.6368055555555555 | 16.636 |
| 0.6375000000000001 | 16.636 |
| 0.6381944444444444 | 16.636 |
| 0.638888888888889 | 12.257 |
| 0.6395833333333333 | 12.257 |
| 0.6402777777777778 | 12.257 |
| 0.6409722222222222 | 7.887 |
| 0.6416666666666667 | 7.887 |
| 0.642361111111111 | 7.887 |
| 0.6430555555555556 | 7.887 |
| 0.6437499999999999 | 7.887 |
| 0.6444444444444445 | 7.887 |
| 0.6451388888888888 | 3.525 |
| 0.6458333333333334 | 3.525 |
| 0.6465277777777778 | 3.525 |
| 0.6472222222222223 | 3.525 |
| 0.6479166666666667 | 3.525 |
| 0.6486111111111111 | 0 |
| 0.6493055555555556 | 0 |
| 0.65 | 0 |
| 0.6506944444444445 | 0 |
| 0.6513888888888889 | 0 |
| 0.6520833333333333 | 0 |
| 0.6527777777777778 | 0 |
| 0.6534722222222222 | 0 |
| 0.6541666666666667 | 0 |
| 0.6548611111111111 | 0 |
| 0.6555555555555556 | 0 |
| 0.65625 | 0 |
| 0.6569444444444444 | 0 |
| 0.6576388888888889 | 0 |
| 0.6583333333333333 | 0 |
| 0.6590277777777778 | 0 |
| 0.6597222222222222 | 0 |
| 0.6604166666666667 | 0 |
| 0.6611111111111111 | 0 |
| 0.6618055555555555 | 0 |
| 0.6625 | 0 |
| 0.6631944444444444 | 0 |
| 0.6638888888888889 | 0 |
| 0.6645833333333333 | 0 |
| 0.6652777777777777 | 0 |
| 0.6659722222222222 | 0 |
| 0.6666666666666666 | 0 |
| 0.6673611111111111 | 0 |
| 0.6680555555555556 | 0 |
| 0.6687500000000001 | 0 |
| 0.6694444444444444 | 0 |
| 0.6701388888888888 | 0 |
| 0.6708333333333334 | 0 |
| 0.6715277777777778 | 0 |
| 0.6722222222222222 | 0 |
| 0.6729166666666666 | 0 |
| 0.6736111111111112 | 0 |
| 0.6743055555555556 | 0 |
| 0.6749999999999999 | 0 |
| 0.6756944444444444 | 0 |
| 0.6763888888888889 | 0 |
| 0.6770833333333334 | 0 |
| 0.6777777777777777 | 0 |
| 0.6784722222222223 | 0 |
| 0.6791666666666667 | 0 |
| 0.6798611111111111 | 0 |
| 0.6805555555555555 | 0 |
| 0.68125 | 0 |
| 0.6819444444444445 | 0 |
| 0.6826388888888889 | 0 |
| 0.6833333333333332 | 0 |
| 0.6840277777777778 | 0 |
| 0.6847222222222222 | 0 |
| 0.6854166666666667 | 0 |
| 0.686111111111111 | 0 |
| 0.6868055555555556 | 0 |
| 0.6875 | 0 |
| 0.6881944444444444 | 0 |
| 0.688888888888889 | 0 |
| 0.6895833333333333 | 0 |
| 0.6902777777777778 | 0 |
| 0.6909722222222222 | 0 |
| 0.6916666666666668 | 0 |
| 0.6923611111111111 | 0 |
| 0.6930555555555555 | 0 |
| 0.69375 | 0 |
| 0.6944444444444445 | 0 |
| 0.6951388888888889 | 0 |
| 0.6958333333333333 | 0 |
| 0.6965277777777777 | 0 |
| 0.6972222222222223 | 0 |
| 0.6979166666666666 | 0 |
| 0.6986111111111111 | 0 |
| 0.6993055555555556 | 0 |
| 0.7000000000000001 | 0 |
| 0.7006944444444444 | 0 |
| 0.7013888888888888 | 0 |
| 0.7020833333333334 | 0 |
| 0.7027777777777778 | 0 |
| 0.7034722222222222 | 0 |
| 0.7041666666666666 | 0 |
| 0.7048611111111112 | 0 |
| 0.7055555555555556 | 0 |
| 0.7062499999999999 | 0 |
| 0.7069444444444444 | 0 |
| 0.7076388888888889 | 0 |
| 0.7083333333333334 | 0 |
| 0.7090277777777777 | 0 |
| 0.7097222222222223 | 0 |
| 0.7104166666666667 | 0 |
| 0.7111111111111111 | 0 |
| 0.7118055555555555 | 0 |
| 0.7125 | 0 |
| 0.7131944444444445 | 0 |
| 0.7138888888888889 | 0 |
| 0.7145833333333332 | 0 |
| 0.7152777777777778 | 0 |
| 0.7159722222222222 | 0 |
| 0.7166666666666667 | 0 |
| 0.717361111111111 | 0 |
| 0.7180555555555556 | 0 |
| 0.71875 | 0 |
| 0.7194444444444444 | 0 |
| 0.720138888888889 | 0 |
| 0.7208333333333333 | 0 |
| 0.7215277777777778 | 0 |
| 0.7222222222222222 | 0 |
| 0.7229166666666668 | 0 |
| 0.7236111111111111 | 0 |
| 0.7243055555555555 | 0 |
| 0.725 | 0 |
| 0.7256944444444445 | 0 |
| 0.7263888888888889 | 0 |
| 0.7270833333333333 | 0 |
| 0.7277777777777777 | 0 |
| 0.7284722222222223 | 0 |
| 0.7291666666666666 | 0 |
| 0.7298611111111111 | 0 |
| 0.7305555555555556 | 0 |
| 0.7312500000000001 | 0 |
| 0.7319444444444444 | 0 |
| 0.7326388888888888 | 0 |
| 0.7333333333333334 | 0 |
| 0.7340277777777778 | 0 |
| 0.7347222222222222 | 0 |
| 0.7354166666666666 | 0 |
| 0.7361111111111112 | 0 |
| 0.7368055555555556 | 0 |
| 0.7374999999999999 | 0 |
| 0.7381944444444444 | 0 |
| 0.7388888888888889 | 0 |
| 0.7395833333333334 | 0 |
| 0.7402777777777777 | 0 |
| 0.7409722222222223 | 0 |
| 0.7416666666666667 | 0 |
| 0.7423611111111111 | 0 |
| 0.7430555555555555 | 0 |
| 0.74375 | 0 |
| 0.7444444444444445 | 0 |
| 0.7451388888888889 | 0 |
| 0.7458333333333332 | 0 |
| 0.7465277777777778 | 0 |
| 0.7472222222222222 | 0 |
| 0.7479166666666667 | 0 |
| 0.748611111111111 | 0 |
| 0.7493055555555556 | 0 |
| 0.75 | 0 |
| 0.7506944444444444 | 0 |
| 0.751388888888889 | 0 |
| 0.7520833333333333 | 0 |
| 0.7527777777777778 | 0 |
| 0.7534722222222222 | 0 |
| 0.7541666666666668 | 0 |
| 0.7548611111111111 | 0 |
| 0.7555555555555555 | 0 |
| 0.75625 | 0 |
| 0.7569444444444445 | 0 |
| 0.7576388888888889 | 0 |
| 0.7583333333333333 | 0 |
| 0.7590277777777777 | 0 |
| 0.7597222222222223 | 0 |
| 0.7604166666666666 | 0 |
| 0.7611111111111111 | 0 |
| 0.7618055555555556 | 0 |
| 0.7625000000000001 | 0 |
| 0.7631944444444444 | 0 |
| 0.7638888888888888 | 0 |
| 0.7645833333333334 | 0 |
| 0.7652777777777778 | 0 |
| 0.7659722222222222 | 0 |
| 0.7666666666666666 | 0 |
| 0.7673611111111112 | 0 |
| 0.7680555555555556 | 0 |
| 0.7687499999999999 | 0 |
| 0.7694444444444444 | 0 |
| 0.7701388888888889 | 0 |
| 0.7708333333333334 | 0 |
| 0.7715277777777777 | 0 |
| 0.7722222222222223 | 0 |
| 0.7729166666666667 | 0 |
| 0.7736111111111111 | 0 |
| 0.7743055555555555 | 0 |
| 0.775 | 0 |
| 0.7756944444444445 | 0 |
| 0.7763888888888889 | 0 |
| 0.7770833333333332 | 0 |
| 0.7777777777777778 | 0 |
| 0.7784722222222222 | 0 |
| 0.7791666666666667 | 0 |
| 0.779861111111111 | 0 |
| 0.7805555555555556 | 0 |
| 0.78125 | 0 |
| 0.7819444444444444 | 0 |
| 0.782638888888889 | 0 |
| 0.7833333333333333 | 0 |
| 0.7840277777777778 | 0 |
| 0.7847222222222222 | 0 |
| 0.7854166666666668 | 0 |
| 0.7861111111111111 | 0 |
| 0.7868055555555555 | 0 |
| 0.7875 | 0 |
| 0.7881944444444445 | 0 |
| 0.7888888888888889 | 0 |
| 0.7895833333333333 | 0 |
| 0.7902777777777777 | 0 |
| 0.7909722222222223 | 0 |
| 0.7916666666666666 | 0 |
| 0.7923611111111111 | 0 |
| 0.7930555555555556 | 0 |
| 0.7937500000000001 | 0 |
| 0.7944444444444444 | 0 |
| 0.7951388888888888 | 0 |
| 0.7958333333333334 | 0 |
| 0.7965277777777778 | 0 |
| 0.7972222222222222 | 0 |
| 0.7979166666666666 | 0 |
| 0.7986111111111112 | 0 |
| 0.7993055555555556 | 0 |
| 0.7999999999999999 | 0 |
| 0.8006944444444444 | 0 |
| 0.8013888888888889 | 0 |
| 0.8020833333333334 | 0 |
| 0.8027777777777777 | 0 |
| 0.8034722222222223 | 0 |
| 0.8041666666666667 | 0 |
| 0.8048611111111111 | 0 |
| 0.8055555555555555 | 0 |
| 0.80625 | 0 |
| 0.8069444444444445 | 0 |
| 0.8076388888888889 | 0 |
| 0.8083333333333332 | 0 |
| 0.8090277777777778 | 0 |
| 0.8097222222222222 | 0 |
| 0.8104166666666667 | 0 |
| 0.811111111111111 | 0 |
| 0.8118055555555556 | 0 |
| 0.8125 | 0 |
| 0.8131944444444444 | 0 |
| 0.813888888888889 | 0 |
| 0.8145833333333333 | 0 |
| 0.8152777777777778 | 0 |
| 0.8159722222222222 | 0 |
| 0.8166666666666668 | 0 |
| 0.8173611111111111 | 0 |
| 0.8180555555555555 | 0 |
| 0.81875 | 0 |
| 0.8194444444444445 | 0 |
| 0.8201388888888889 | 0 |
| 0.8208333333333333 | 0 |
| 0.8215277777777777 | 0 |
| 0.8222222222222223 | 0 |
| 0.8229166666666666 | 0 |
| 0.8236111111111111 | 0 |
| 0.8243055555555556 | 0 |
| 0.8250000000000001 | 0 |
| 0.8256944444444444 | 0 |
| 0.8263888888888888 | 0 |
| 0.8270833333333334 | 0 |
| 0.8277777777777778 | 0 |
| 0.8284722222222222 | 0 |
| 0.8291666666666666 | 0 |
| 0.8298611111111112 | 0 |
| 0.8305555555555556 | 0 |
| 0.8312499999999999 | 0 |
| 0.8319444444444444 | 0 |
| 0.8326388888888889 | 0 |
| 0.8333333333333334 | 0 |
| 0.8340277777777777 | 0 |
| 0.8347222222222223 | 0 |
| 0.8354166666666667 | 0 |
| 0.8361111111111111 | 0 |
| 0.8368055555555555 | 0 |
| 0.8375 | 0 |
| 0.8381944444444445 | 0 |
| 0.8388888888888889 | 0 |
| 0.8395833333333332 | 0 |
| 0.8402777777777778 | 0 |
| 0.8409722222222222 | 0 |
| 0.8416666666666667 | 0 |
| 0.842361111111111 | 0 |
| 0.8430555555555556 | 0 |
| 0.84375 | 0 |
| 0.8444444444444444 | 0 |
| 0.845138888888889 | 0 |
| 0.8458333333333333 | 0 |
| 0.8465277777777778 | 0 |
| 0.8472222222222222 | 0 |
| 0.8479166666666668 | 0 |
| 0.8486111111111111 | 0 |
| 0.8493055555555555 | 0 |
| 0.85 | 0 |
| 0.8506944444444445 | 0 |
| 0.8513888888888889 | 0 |
| 0.8520833333333333 | 0 |
| 0.8527777777777777 | 0 |
| 0.8534722222222223 | 0 |
| 0.8541666666666666 | 0 |
| 0.8548611111111111 | 0 |
| 0.8555555555555556 | 0 |
| 0.8562500000000001 | 0 |
| 0.8569444444444444 | 0 |
| 0.8576388888888888 | 0 |
| 0.8583333333333334 | 0 |
| 0.8590277777777778 | 0 |
| 0.8597222222222222 | 0 |
| 0.8604166666666666 | 0 |
| 0.8611111111111112 | 0 |
| 0.8618055555555556 | 0 |
| 0.8624999999999999 | 0 |
| 0.8631944444444444 | 0 |
| 0.8638888888888889 | 0 |
| 0.8645833333333334 | 0 |
| 0.8652777777777777 | 0 |
| 0.8659722222222223 | 0 |
| 0.8666666666666667 | 0 |
| 0.8673611111111111 | 0 |
| 0.8680555555555555 | 0 |
| 0.86875 | 0 |
| 0.8694444444444445 | 0 |
| 0.8701388888888889 | 0 |
| 0.8708333333333332 | 0 |
| 0.8715277777777778 | 0 |
| 0.8722222222222222 | 0 |
| 0.8729166666666667 | 0 |
| 0.873611111111111 | 0 |
| 0.8743055555555556 | 0 |
| 0.875 | 0 |
| 0.8756944444444444 | 0 |
| 0.876388888888889 | 0 |
| 0.8770833333333333 | 0 |
| 0.8777777777777778 | 0 |
| 0.8784722222222222 | 0 |
| 0.8791666666666668 | 0 |
| 0.8798611111111111 | 0 |
| 0.8805555555555555 | 0 |
| 0.88125 | 0 |
| 0.8819444444444445 | 0 |
| 0.8826388888888889 | 0 |
| 0.8833333333333333 | 0 |
| 0.8840277777777777 | 0 |
| 0.8847222222222223 | 0 |
| 0.8854166666666666 | 0 |
| 0.8861111111111111 | 0 |
| 0.8868055555555556 | 0 |
| 0.8875000000000001 | 0 |
| 0.8881944444444444 | 0 |
| 0.8888888888888888 | 0 |
| 0.8895833333333334 | 0 |
| 0.8902777777777778 | 0 |
| 0.8909722222222222 | 0 |
| 0.8916666666666666 | 0 |
| 0.8923611111111112 | 0 |
| 0.8930555555555556 | 0 |
| 0.8937499999999999 | 0 |
| 0.8944444444444444 | 0 |
| 0.8951388888888889 | 0 |
| 0.8958333333333334 | 0 |
| 0.8965277777777777 | 0 |
| 0.8972222222222223 | 0 |
| 0.8979166666666667 | 0 |
| 0.8986111111111111 | 0 |
| 0.8993055555555555 | 0 |
| 0.9 | 0 |
| 0.9006944444444445 | 0 |
| 0.9013888888888889 | 0 |
| 0.9020833333333332 | 0 |
| 0.9027777777777778 | 0 |
| 0.9034722222222222 | 0 |
| 0.9041666666666667 | 0 |
| 0.904861111111111 | 0 |
| 0.9055555555555556 | 0 |
| 0.90625 | 0 |
| 0.9069444444444444 | 0 |
| 0.907638888888889 | 0 |
| 0.9083333333333333 | 0 |
| 0.9090277777777778 | 0 |
| 0.9097222222222222 | 0 |
| 0.9104166666666668 | 0 |
| 0.9111111111111111 | 0 |
| 0.9118055555555555 | 0 |
| 0.9125 | 0 |
| 0.9131944444444445 | 0 |
| 0.9138888888888889 | 0 |
| 0.9145833333333333 | 0 |
| 0.9152777777777777 | 0 |
| 0.9159722222222223 | 0 |
| 0.9166666666666666 | 0 |
| 0.9173611111111111 | 0 |
| 0.9180555555555556 | 0 |
| 0.9187500000000001 | 0 |
| 0.9194444444444444 | 0 |
| 0.9201388888888888 | 0 |
| 0.9208333333333334 | 0 |
| 0.9215277777777778 | 0 |
| 0.9222222222222222 | 0 |
| 0.9229166666666666 | 0 |
| 0.9236111111111112 | 0 |
| 0.9243055555555556 | 0 |
| 0.9249999999999999 | 0 |
| 0.9256944444444444 | 0 |
| 0.9263888888888889 | 0 |
| 0.9270833333333334 | 0 |
| 0.9277777777777777 | 0 |
| 0.9284722222222223 | 0 |
| 0.9291666666666667 | 0 |
| 0.9298611111111111 | 0 |
| 0.9305555555555555 | 0 |
| 0.93125 | 0 |
| 0.9319444444444445 | 0 |
| 0.9326388888888889 | 0 |
| 0.9333333333333332 | 0 |
| 0.9340277777777778 | 0 |
| 0.9347222222222222 | 0 |
| 0.9354166666666667 | 0 |
| 0.936111111111111 | 0 |
| 0.9368055555555556 | 0 |
| 0.9375 | 0 |
| 0.9381944444444444 | 0 |
| 0.938888888888889 | 0 |
| 0.9395833333333333 | 0 |
| 0.9402777777777778 | 0 |
| 0.9409722222222222 | 0 |
| 0.9416666666666668 | 0 |
| 0.9423611111111111 | 0 |
| 0.9430555555555555 | 0 |
| 0.94375 | 0 |
| 0.9444444444444445 | 0 |
| 0.9451388888888889 | 0 |
| 0.9458333333333333 | 0 |
| 0.9465277777777777 | 0 |
| 0.9472222222222223 | 0 |
| 0.9479166666666666 | 0 |
| 0.9486111111111111 | 0 |
| 0.9493055555555556 | 0 |
| 0.9500000000000001 | 0 |
| 0.9506944444444444 | 0 |
| 0.9513888888888888 | 0 |
| 0.9520833333333334 | 0 |
| 0.9527777777777778 | 0 |
| 0.9534722222222222 | 0 |
| 0.9541666666666666 | 0 |
| 0.9548611111111112 | 0 |
| 0.9555555555555556 | 0 |
| 0.9562499999999999 | 0 |
| 0.9569444444444444 | 0 |
| 0.9576388888888889 | 0 |
| 0.9583333333333334 | 0 |
| 0.9590277777777777 | 0 |
| 0.9597222222222223 | 0 |
| 0.9604166666666667 | 0 |
| 0.9611111111111111 | 0 |
| 0.9618055555555555 | 0 |
| 0.9625 | 0 |
| 0.9631944444444445 | 0 |
| 0.9638888888888889 | 0 |
| 0.9645833333333332 | 0 |
| 0.9652777777777778 | 0 |
| 0.9659722222222222 | 0 |
| 0.9666666666666667 | 0 |
| 0.967361111111111 | 0 |
| 0.9680555555555556 | 0 |
| 0.96875 | 0 |
| 0.9694444444444444 | 0 |
| 0.970138888888889 | 0 |
| 0.9708333333333333 | 0 |
| 0.9715277777777778 | 0 |
| 0.9722222222222222 | 0 |
| 0.9729166666666668 | 0 |
| 0.9736111111111111 | 0 |
| 0.9743055555555555 | 0 |
| 0.975 | 0 |
| 0.9756944444444445 | 0 |
| 0.9763888888888889 | 0 |
| 0.9770833333333333 | 0 |
| 0.9777777777777777 | 0 |
| 0.9784722222222223 | 0 |
| 0.9791666666666666 | 0 |
| 0.9798611111111111 | 0 |
| 0.9805555555555556 | 0 |
| 0.9812500000000001 | 0 |
| 0.9819444444444444 | 0 |
| 0.9826388888888888 | 0 |
| 0.9833333333333334 | 0 |
| 0.9840277777777778 | 0 |
| 0.9847222222222222 | 0 |
| 0.9854166666666666 | 0 |
| 0.9861111111111112 | 0 |
| 0.9868055555555556 | 0 |
| 0.9874999999999999 | 0 |
| 0.9881944444444444 | 0 |
| 0.9888888888888889 | 0 |
| 0.9895833333333334 | 0 |
| 0.9902777777777777 | 0 |
| 0.9909722222222223 | 0 |
| 0.9916666666666667 | 0 |
| 0.9923611111111111 | 0 |
| 0.9930555555555555 | 0 |
| 0.99375 | 0 |
| 0.9944444444444445 | 0 |
| 0.9951388888888889 | 0 |
| 0.9958333333333332 | 0 |
| 0.9965277777777778 | 0 |
| 0.9972222222222222 | 0 |
| 0.9979166666666667 | 0 |
| 0.998611111111111 | 0 |
| 0.9993055555555556 | 0 |